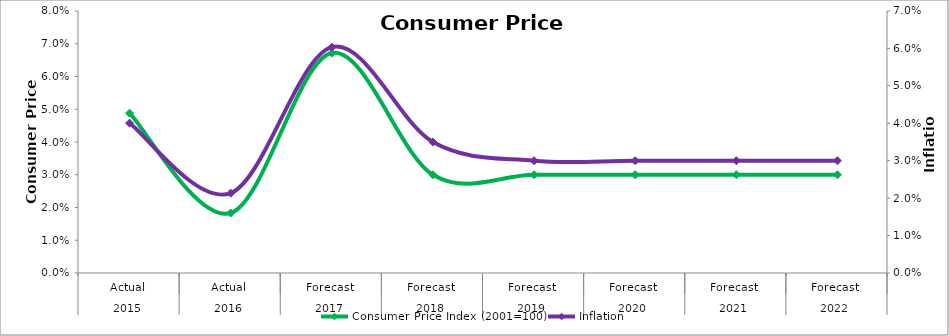
| Category | Consumer Price Index (2001=100) |
|---|---|
| 0 | 0.049 |
| 1 | 0.018 |
| 2 | 0.067 |
| 3 | 0.03 |
| 4 | 0.03 |
| 5 | 0.03 |
| 6 | 0.03 |
| 7 | 0.03 |